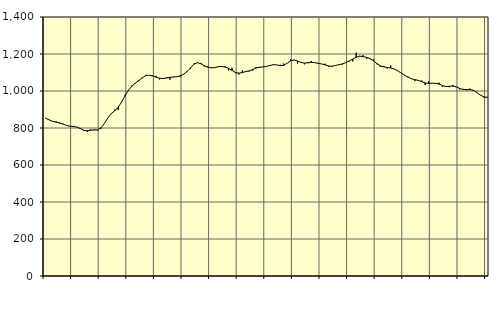
| Category | Piggar | Series 1 |
|---|---|---|
| nan | 855.5 | 852.33 |
| 87.0 | 844.7 | 843.5 |
| 87.0 | 833.2 | 835.86 |
| 87.0 | 836.4 | 831.51 |
| nan | 824.9 | 827.8 |
| 88.0 | 823.3 | 821.09 |
| 88.0 | 813.3 | 814.09 |
| 88.0 | 810.9 | 809.79 |
| nan | 811.6 | 808.12 |
| 89.0 | 804.9 | 805.28 |
| 89.0 | 800.1 | 797.21 |
| 89.0 | 783.3 | 788.25 |
| nan | 778.5 | 785.25 |
| 90.0 | 793.7 | 787.85 |
| 90.0 | 791.8 | 789.19 |
| 90.0 | 786.5 | 789.55 |
| nan | 796.2 | 799.88 |
| 91.0 | 824.5 | 824.07 |
| 91.0 | 853 | 853.96 |
| 91.0 | 877.2 | 877.69 |
| nan | 899.6 | 893.27 |
| 92.0 | 897 | 911.98 |
| 92.0 | 942.5 | 940.43 |
| 92.0 | 980.3 | 974.82 |
| nan | 1003.2 | 1005.1 |
| 93.0 | 1030.4 | 1026.45 |
| 93.0 | 1039.7 | 1042.43 |
| 93.0 | 1052.3 | 1057.24 |
| nan | 1069 | 1072.12 |
| 94.0 | 1087.9 | 1082.55 |
| 94.0 | 1085.5 | 1085.31 |
| 94.0 | 1084.8 | 1081.5 |
| nan | 1081.8 | 1074.77 |
| 95.0 | 1062.5 | 1069.05 |
| 95.0 | 1069.1 | 1067.45 |
| 95.0 | 1074.4 | 1070.1 |
| nan | 1060.9 | 1073.81 |
| 96.0 | 1078.2 | 1075.52 |
| 96.0 | 1078.7 | 1077.09 |
| 96.0 | 1076.2 | 1081.95 |
| nan | 1091.3 | 1090.7 |
| 97.0 | 1103.6 | 1105.63 |
| 97.0 | 1121 | 1125.7 |
| 97.0 | 1149.1 | 1145.35 |
| nan | 1156.8 | 1153.23 |
| 98.0 | 1151.4 | 1146.89 |
| 98.0 | 1132.5 | 1136.18 |
| 98.0 | 1133.9 | 1128.53 |
| nan | 1123.9 | 1125.25 |
| 99.0 | 1125.8 | 1126.72 |
| 99.0 | 1132.9 | 1131.29 |
| 99.0 | 1133.7 | 1132.92 |
| nan | 1132.7 | 1129.38 |
| 0.0 | 1111.4 | 1122.52 |
| 0.0 | 1125.7 | 1111.62 |
| 0.0 | 1096.1 | 1100.26 |
| nan | 1088.8 | 1096.35 |
| 1.0 | 1111.1 | 1100.13 |
| 1.0 | 1102.5 | 1105.09 |
| 1.0 | 1104.9 | 1108.84 |
| nan | 1110 | 1116.12 |
| 2.0 | 1129.6 | 1124.53 |
| 2.0 | 1125.5 | 1128.58 |
| 2.0 | 1129.5 | 1130 |
| nan | 1134.3 | 1133 |
| 3.0 | 1134.9 | 1137.9 |
| 3.0 | 1144.6 | 1142.18 |
| 3.0 | 1141 | 1141.28 |
| nan | 1142 | 1136.75 |
| 4.0 | 1148.6 | 1138.54 |
| 4.0 | 1151 | 1150.26 |
| 4.0 | 1170.2 | 1163.47 |
| nan | 1170 | 1167.6 |
| 5.0 | 1148.1 | 1161.96 |
| 5.0 | 1155.3 | 1154.13 |
| 5.0 | 1144.1 | 1150.6 |
| nan | 1150.6 | 1152.62 |
| 6.0 | 1162.5 | 1154.97 |
| 6.0 | 1154.2 | 1153.21 |
| 6.0 | 1151.7 | 1149.31 |
| nan | 1146.5 | 1146.07 |
| 7.0 | 1147.5 | 1140.99 |
| 7.0 | 1131 | 1135.23 |
| 7.0 | 1131.3 | 1134.19 |
| nan | 1138.3 | 1138.01 |
| 8.0 | 1143.9 | 1142.24 |
| 8.0 | 1143.3 | 1146.4 |
| 8.0 | 1156.1 | 1153.45 |
| nan | 1160 | 1162.23 |
| 9.0 | 1159.8 | 1172.54 |
| 9.0 | 1206.7 | 1182.73 |
| 9.0 | 1190.2 | 1188.09 |
| nan | 1193.8 | 1186.09 |
| 10.0 | 1174.6 | 1181.37 |
| 10.0 | 1176.1 | 1175.31 |
| 10.0 | 1170.8 | 1163.78 |
| nan | 1144.3 | 1148.42 |
| 11.0 | 1131.4 | 1136.17 |
| 11.0 | 1136.2 | 1129.91 |
| 11.0 | 1120.8 | 1127.41 |
| nan | 1138.3 | 1124.8 |
| 12.0 | 1119.3 | 1119.34 |
| 12.0 | 1109 | 1109.52 |
| 12.0 | 1096.9 | 1097.07 |
| nan | 1084.7 | 1085.85 |
| 13.0 | 1077.4 | 1074.85 |
| 13.0 | 1068 | 1066.14 |
| 13.0 | 1053.3 | 1061.67 |
| nan | 1059.3 | 1057.29 |
| 14.0 | 1057.3 | 1050.62 |
| 14.0 | 1032.2 | 1043.71 |
| 14.0 | 1051.9 | 1040.63 |
| nan | 1040.9 | 1041.93 |
| 15.0 | 1040.1 | 1041.82 |
| 15.0 | 1045.2 | 1037.27 |
| 15.0 | 1022.4 | 1029.72 |
| nan | 1023.1 | 1024.05 |
| 16.0 | 1020.6 | 1025.34 |
| 16.0 | 1033 | 1026.66 |
| 16.0 | 1022.7 | 1022.17 |
| nan | 1008.6 | 1013.83 |
| 17.0 | 1011.5 | 1008 |
| 17.0 | 1003.2 | 1007.56 |
| 17.0 | 1013.2 | 1007.52 |
| nan | 1006.2 | 1002.87 |
| 18.0 | 990.4 | 991.56 |
| 18.0 | 976.8 | 977.77 |
| 18.0 | 964.9 | 968.7 |
| nan | 968.4 | 964.91 |